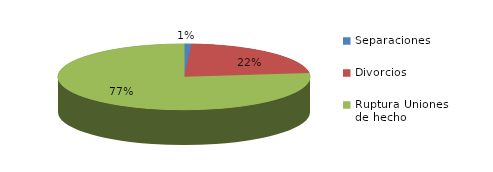
| Category | Series 0 |
|---|---|
| Separaciones | 78 |
| Divorcios | 1846 |
| Ruptura Uniones de hecho | 6408 |